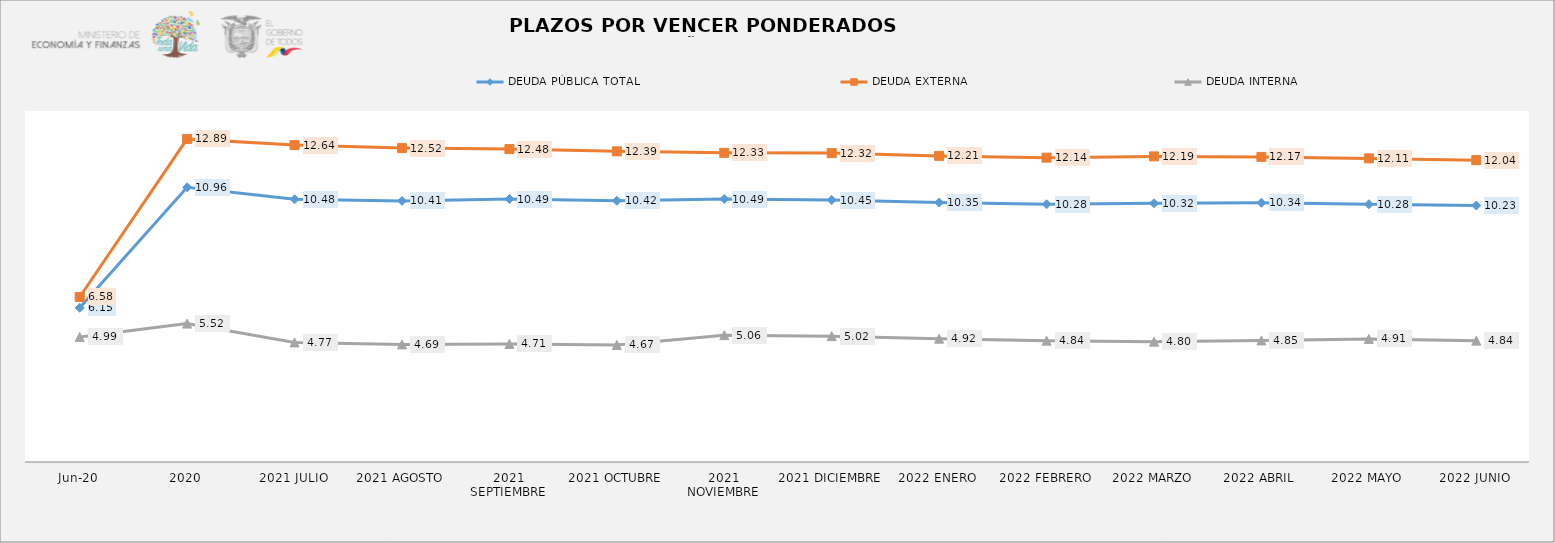
| Category | DEUDA PÚBLICA TOTAL | DEUDA EXTERNA  | DEUDA INTERNA |
|---|---|---|---|
| jun-20 | 6.152 | 6.581 | 4.989 |
| 2020 | 10.957 | 12.887 | 5.519 |
| 2021 JULIO | 10.48 | 12.64 | 4.77 |
| 2021 AGOSTO | 10.414 | 12.52 | 4.69 |
| 2021 SEPTIEMBRE | 10.49 | 12.48 | 4.71 |
| 2021 OCTUBRE | 10.42 | 12.39 | 4.67 |
| 2021 NOVIEMBRE | 10.49 | 12.33 | 5.06 |
| 2021 DICIEMBRE | 10.45 | 12.32 | 5.02 |
| 2022 ENERO | 10.35 | 12.21 | 4.92 |
| 2022 FEBRERO | 10.28 | 12.14 | 4.84 |
| 2022 MARZO | 10.32 | 12.19 | 4.8 |
| 2022 ABRIL | 10.34 | 12.17 | 4.85 |
| 2022 MAYO | 10.28 | 12.11 | 4.91 |
| 2022 JUNIO | 10.23 | 12.04 | 4.84 |